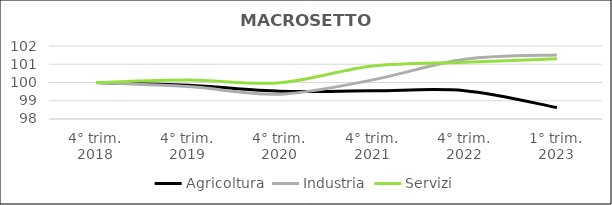
| Category | Agricoltura | Industria | Servizi |
|---|---|---|---|
| 4° trim.
2018 | 100 | 100 | 100 |
| 4° trim.
2019 | 99.848 | 99.778 | 100.135 |
| 4° trim.
2020 | 99.516 | 99.363 | 99.989 |
| 4° trim.
2021 | 99.543 | 100.143 | 100.904 |
| 4° trim.
2022 | 99.55 | 101.275 | 101.113 |
| 1° trim.
2023 | 98.629 | 101.508 | 101.3 |